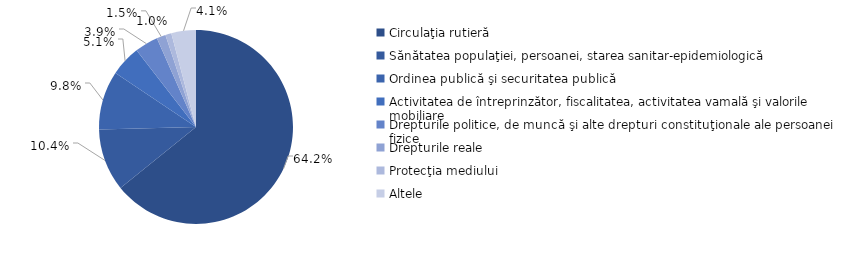
| Category | Series 0 |
|---|---|
| Circulaţia rutieră | 0.642 |
| Sănătatea populaţiei, persoanei, starea sanitar-epidemiologică | 0.104 |
| Ordinea publică şi securitatea publică | 0.098 |
| Activitatea de întreprinzător, fiscalitatea, activitatea vamală şi valorile mobiliare | 0.051 |
| Drepturile politice, de muncă şi alte drepturi constituţionale ale persoanei fizice  | 0.039 |
| Drepturile reale | 0.015 |
| Protecţia mediului | 0.01 |
| Altele | 0.041 |